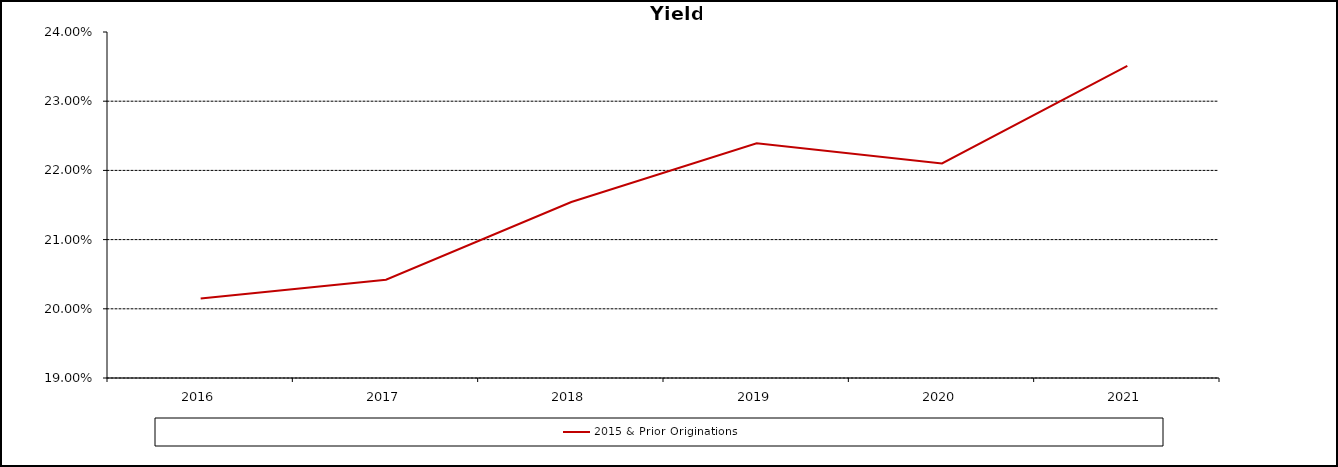
| Category | 2015 & Prior Originations |
|---|---|
| 2016.0 | 0.202 |
| 2017.0 | 0.204 |
| 2018.0 | 0.215 |
| 2019.0 | 0.224 |
| 2020.0 | 0.221 |
| 2021.0 | 0.235 |